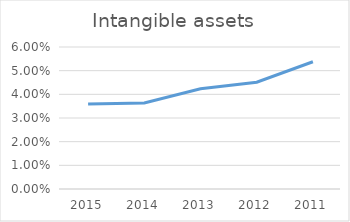
| Category | Intangible assets |
|---|---|
| 2015.0 | 0.036 |
| 2014.0 | 0.036 |
| 2013.0 | 0.042 |
| 2012.0 | 0.045 |
| 2011.0 | 0.054 |